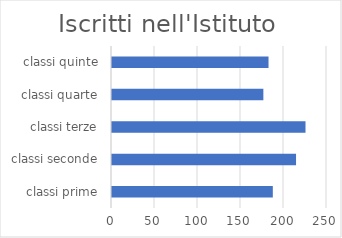
| Category | Series 0 |
|---|---|
| classi prime | 187 |
| classi seconde | 214 |
| classi terze | 225 |
| classi quarte | 176 |
| classi quinte | 182 |